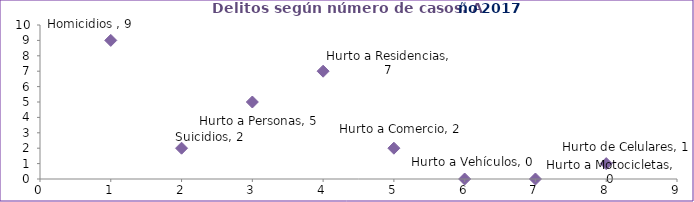
| Category | Series 0 |
|---|---|
| 0 | 9 |
| 1 | 2 |
| 2 | 5 |
| 3 | 7 |
| 4 | 2 |
| 5 | 0 |
| 6 | 0 |
| 7 | 1 |